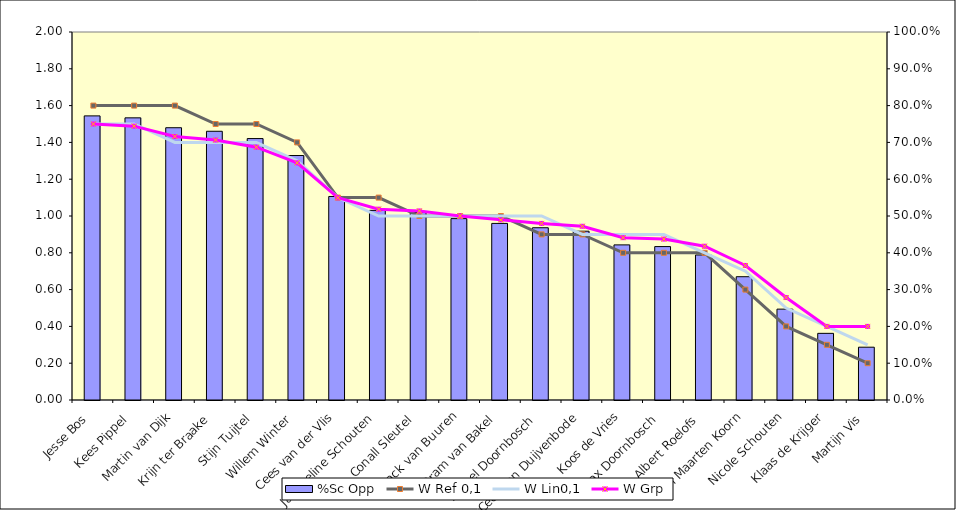
| Category | %Sc Opp |
|---|---|
| Jesse Bos | 0.772 |
| Kees Pippel | 0.767 |
| Martin van Dijk | 0.74 |
| Krijn ter Braake | 0.73 |
| Stijn Tuijtel | 0.71 |
| Willem Winter | 0.664 |
| Cees van der Vlis | 0.553 |
| Jacqueline Schouten | 0.515 |
| Conall Sleutel | 0.509 |
| Jack van Buuren | 0.493 |
| Bram van Bakel | 0.48 |
| Marcel Doornbosch | 0.468 |
| Cees van Duijvenbode | 0.459 |
| Koos de Vries | 0.421 |
| Max Doornbosch | 0.417 |
| Albert Roelofs | 0.394 |
| Jan Maarten Koorn | 0.335 |
| Nicole Schouten | 0.247 |
| Klaas de Krijger | 0.181 |
| Martijn Vis | 0.143 |